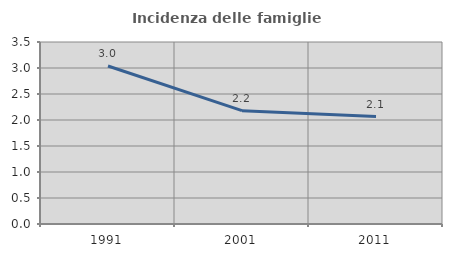
| Category | Incidenza delle famiglie numerose |
|---|---|
| 1991.0 | 3.039 |
| 2001.0 | 2.18 |
| 2011.0 | 2.066 |